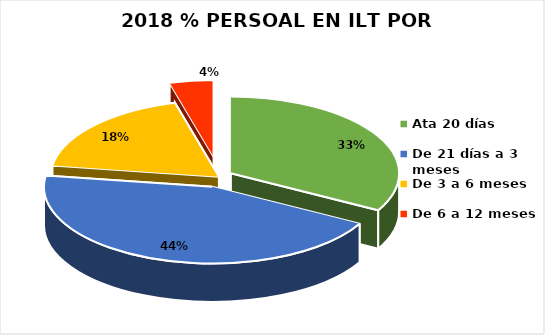
| Category | Series 0 |
|---|---|
| Ata 20 días | 102 |
| De 21 días a 3 meses | 137 |
| De 3 a 6 meses | 57 |
| De 6 a 12 meses | 13 |